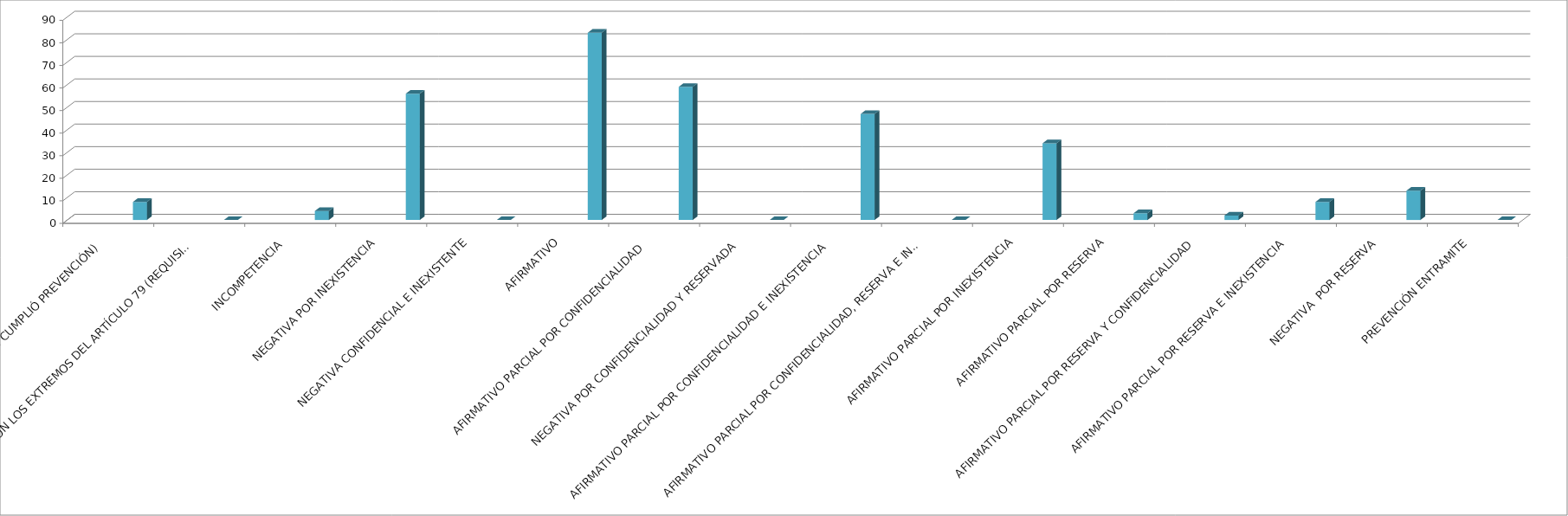
| Category | Series 0 | Series 1 | Series 2 | Series 3 | Series 4 |
|---|---|---|---|---|---|
| SE TIENE POR NO PRESENTADA ( NO CUMPLIÓ PREVENCIÓN) |  |  |  |  | 8 |
| NO CUMPLIO CON LOS EXTREMOS DEL ARTÍCULO 79 (REQUISITOS) |  |  |  |  | 0 |
| INCOMPETENCIA  |  |  |  |  | 4 |
| NEGATIVA POR INEXISTENCIA |  |  |  |  | 56 |
| NEGATIVA CONFIDENCIAL E INEXISTENTE |  |  |  |  | 0 |
| AFIRMATIVO |  |  |  |  | 83 |
| AFIRMATIVO PARCIAL POR CONFIDENCIALIDAD  |  |  |  |  | 59 |
| NEGATIVA POR CONFIDENCIALIDAD Y RESERVADA |  |  |  |  | 0 |
| AFIRMATIVO PARCIAL POR CONFIDENCIALIDAD E INEXISTENCIA |  |  |  |  | 47 |
| AFIRMATIVO PARCIAL POR CONFIDENCIALIDAD, RESERVA E INEXISTENCIA |  |  |  |  | 0 |
| AFIRMATIVO PARCIAL POR INEXISTENCIA |  |  |  |  | 34 |
| AFIRMATIVO PARCIAL POR RESERVA |  |  |  |  | 3 |
| AFIRMATIVO PARCIAL POR RESERVA Y CONFIDENCIALIDAD |  |  |  |  | 2 |
| AFIRMATIVO PARCIAL POR RESERVA E INEXISTENCIA |  |  |  |  | 8 |
| NEGATIVA  POR RESERVA |  |  |  |  | 13 |
| PREVENCIÓN ENTRAMITE |  |  |  |  | 0 |